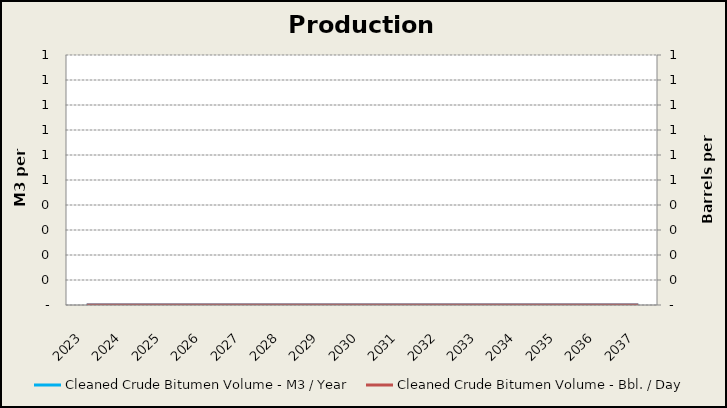
| Category | Cleaned Crude Bitumen Volume - M3 / Year |
|---|---|
| 2023.0 | 0 |
| 2024.0 | 0 |
| 2025.0 | 0 |
| 2026.0 | 0 |
| 2027.0 | 0 |
| 2028.0 | 0 |
| 2029.0 | 0 |
| 2030.0 | 0 |
| 2031.0 | 0 |
| 2032.0 | 0 |
| 2033.0 | 0 |
| 2034.0 | 0 |
| 2035.0 | 0 |
| 2036.0 | 0 |
| 2037.0 | 0 |